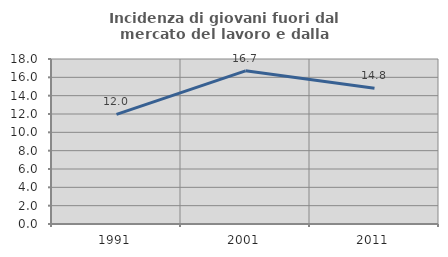
| Category | Incidenza di giovani fuori dal mercato del lavoro e dalla formazione  |
|---|---|
| 1991.0 | 11.962 |
| 2001.0 | 16.711 |
| 2011.0 | 14.804 |